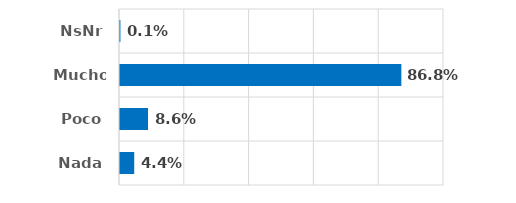
| Category | Series 0 |
|---|---|
| Nada | 0.044 |
| Poco | 0.086 |
| Mucho | 0.868 |
| NsNr | 0.001 |